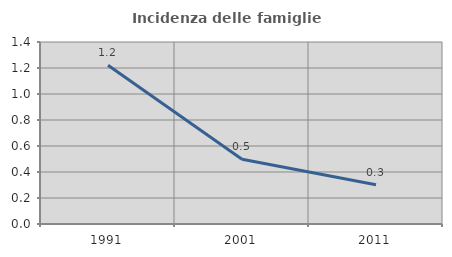
| Category | Incidenza delle famiglie numerose |
|---|---|
| 1991.0 | 1.222 |
| 2001.0 | 0.498 |
| 2011.0 | 0.301 |